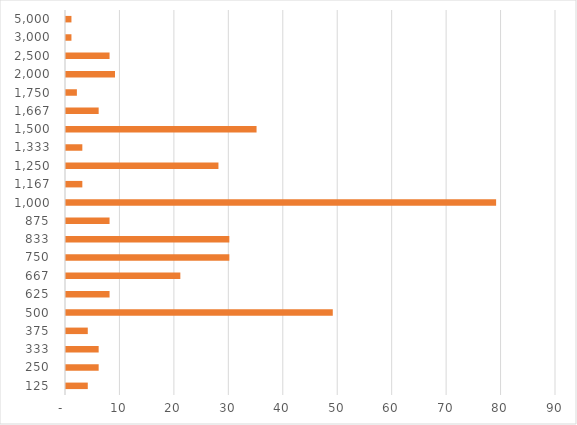
| Category | Series 1 |
|---|---|
| 125.0 | 4 |
| 250.0 | 6 |
| 333.3333333333333 | 6 |
| 375.0 | 4 |
| 500.0 | 49 |
| 625.0 | 8 |
| 666.6666666666666 | 21 |
| 750.0 | 30 |
| 833.3333333333334 | 30 |
| 875.0 | 8 |
| 1000.0 | 79 |
| 1166.6666666666667 | 3 |
| 1250.0 | 28 |
| 1333.3333333333333 | 3 |
| 1500.0 | 35 |
| 1666.6666666666667 | 6 |
| 1750.0 | 2 |
| 2000.0 | 9 |
| 2500.0 | 8 |
| 3000.0 | 1 |
| 5000.0 | 1 |